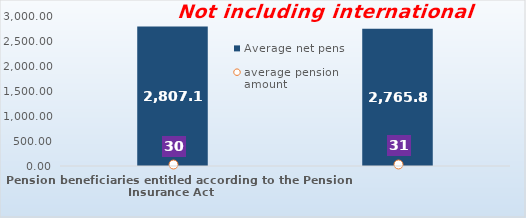
| Category | Average net pension  |
|---|---|
| Pension beneficiaries entitled according to the Pension Insurance Act   | 2807.12 |
| Pension beneficiaries entitled to pension FOR THE FIRST TIME in 2020 according to the Pension Insurance Act  - NEW BENEFICIARIES | 2765.814 |